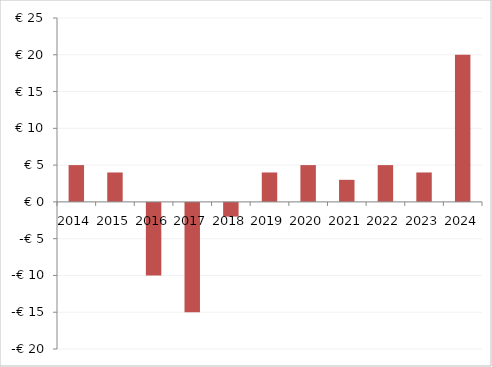
| Category | Series 1 |
|---|---|
| 2014.0 | 5 |
| 2015.0 | 4 |
| 2016.0 | -10 |
| 2017.0 | -15 |
| 2018.0 | -2 |
| 2019.0 | 4 |
| 2020.0 | 5 |
| 2021.0 | 3 |
| 2022.0 | 5 |
| 2023.0 | 4 |
| 2024.0 | 20 |